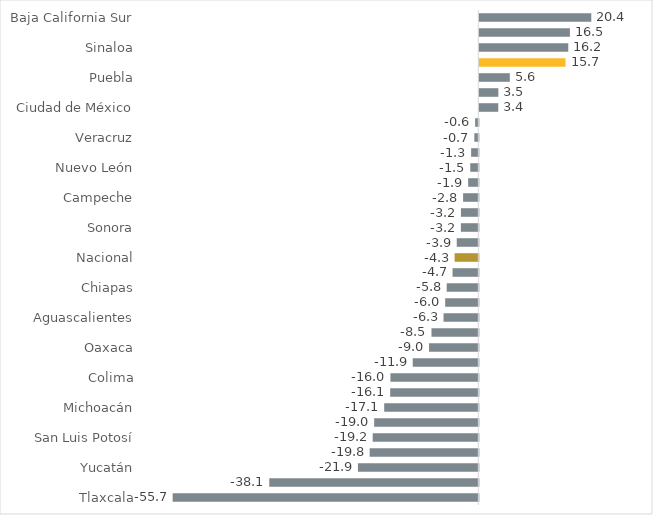
| Category | Series 0 |
|---|---|
| Tlaxcala | -55.692 |
| Tabasco | -38.087 |
| Yucatán | -21.932 |
| Hidalgo | -19.8 |
| San Luis Potosí | -19.245 |
| Estado de México | -18.974 |
| Michoacán | -17.147 |
| Baja California | -16.058 |
| Colima | -16.015 |
| Morelos | -11.946 |
| Oaxaca | -8.983 |
| Tamaulipas | -8.535 |
| Aguascalientes | -6.341 |
| Guanajuato | -6.04 |
| Chiapas | -5.764 |
| Coahuila | -4.701 |
| Nacional | -4.317 |
| Chihuahua | -3.934 |
| Sonora | -3.178 |
| Querétaro | -3.171 |
| Campeche | -2.774 |
| Zacatecas | -1.856 |
| Nuevo León | -1.47 |
| Nayarit | -1.311 |
| Veracruz | -0.728 |
| Quintana Roo | -0.583 |
| Ciudad de México | 3.446 |
| Durango | 3.464 |
| Puebla | 5.553 |
| Jalisco | 15.705 |
| Sinaloa | 16.204 |
| Guerrero | 16.503 |
| Baja California Sur | 20.396 |